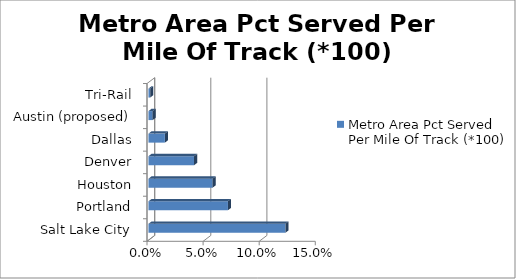
| Category | Metro Area Pct Served Per Mile Of Track (*100) |
|---|---|
| Salt Lake City | 0.122 |
| Portland | 0.071 |
| Houston | 0.057 |
| Denver | 0.041 |
| Dallas | 0.015 |
| Austin (proposed) | 0.004 |
| Tri-Rail | 0.002 |